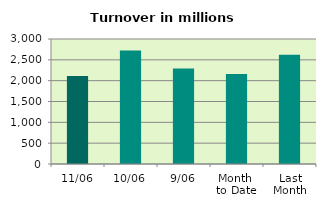
| Category | Series 0 |
|---|---|
| 11/06 | 2109.167 |
| 10/06 | 2722.787 |
| 9/06 | 2289.474 |
| Month 
to Date | 2159.953 |
| Last
Month | 2619.784 |